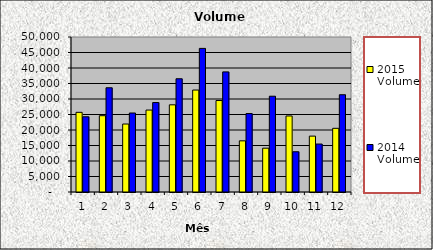
| Category | 2015 Volume | 2014 Volume |
|---|---|---|
| 0 | 25696.667 | 24266.667 |
| 1 | 24613.333 | 33626.667 |
| 2 | 21926.667 | 25480 |
| 3 | 26433.333 | 28860 |
| 4 | 28123.333 | 36530 |
| 5 | 32890 | 46323.333 |
| 6 | 29510 | 38740 |
| 7 | 16504 | 25306.667 |
| 8 | 14135.86 | 30893 |
| 9 | 24522.54 | 12987 |
| 10 | 18027 | 15470 |
| 11 | 20540 | 31373.333 |